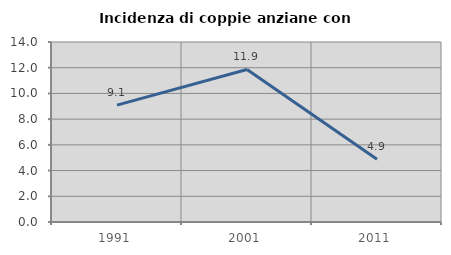
| Category | Incidenza di coppie anziane con figli |
|---|---|
| 1991.0 | 9.091 |
| 2001.0 | 11.864 |
| 2011.0 | 4.878 |